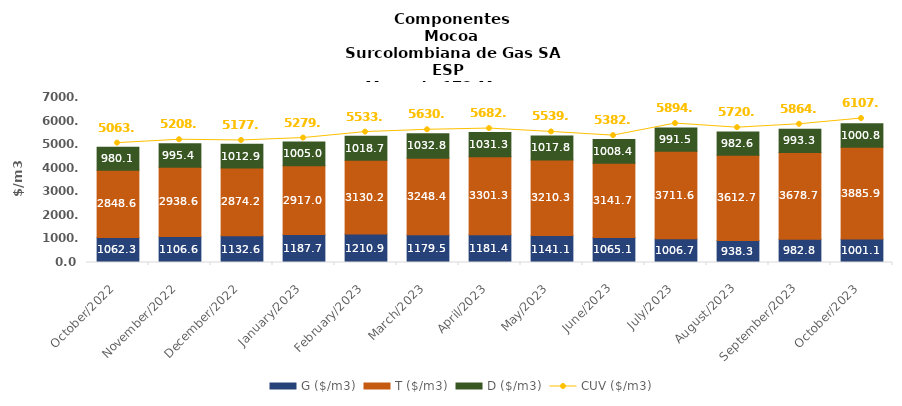
| Category | G ($/m3) | T ($/m3) | D ($/m3) |
|---|---|---|---|
| 2022-10-01 | 1062.28 | 2848.55 | 980.12 |
| 2022-11-01 | 1106.58 | 2938.59 | 995.43 |
| 2022-12-01 | 1132.64 | 2874.17 | 1012.88 |
| 2023-01-01 | 1187.7 | 2917.03 | 1005.02 |
| 2023-02-01 | 1210.89 | 3130.19 | 1018.71 |
| 2023-03-01 | 1179.48 | 3248.44 | 1032.83 |
| 2023-04-01 | 1181.36 | 3301.34 | 1031.34 |
| 2023-05-01 | 1141.05 | 3210.28 | 1017.81 |
| 2023-06-01 | 1065.07 | 3141.65 | 1008.39 |
| 2023-07-01 | 1006.71 | 3711.61 | 991.5 |
| 2023-08-01 | 938.29 | 3612.73 | 982.58 |
| 2023-09-01 | 982.76 | 3678.68 | 993.3 |
| 2023-10-01 | 1001.11 | 3885.88 | 1000.84 |